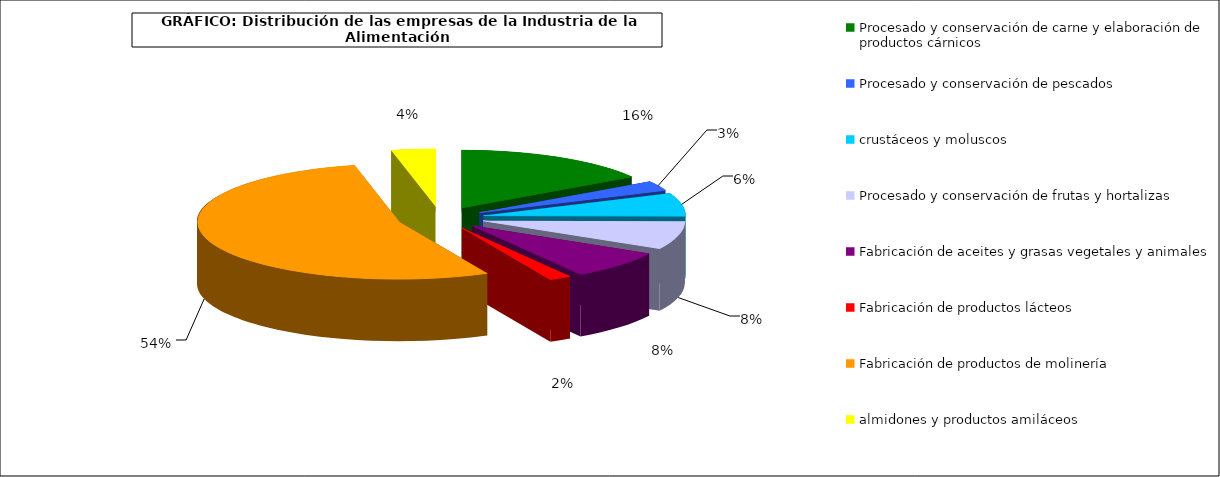
| Category | Procesado y conservación de carne y elaboración de productos cárnicos |
|---|---|
| 0 | 3244 |
| 1 | 550 |
| 2 | 1318 |
| 3 | 1609 |
| 4 | 1620 |
| 5 | 363 |
| 6 | 10924 |
| 7 | 716 |